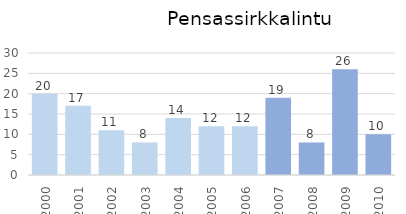
| Category | Series 0 |
|---|---|
| 2000.0 | 20 |
| 2001.0 | 17 |
| 2002.0 | 11 |
| 2003.0 | 8 |
| 2004.0 | 14 |
| 2005.0 | 12 |
| 2006.0 | 12 |
| 2007.0 | 19 |
| 2008.0 | 8 |
| 2009.0 | 26 |
| 2010.0 | 10 |